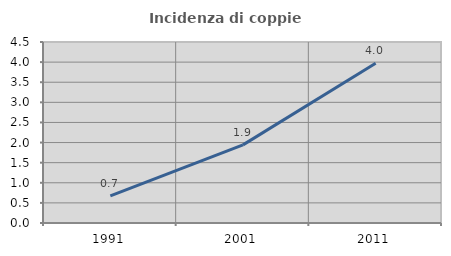
| Category | Incidenza di coppie miste |
|---|---|
| 1991.0 | 0.673 |
| 2001.0 | 1.942 |
| 2011.0 | 3.97 |